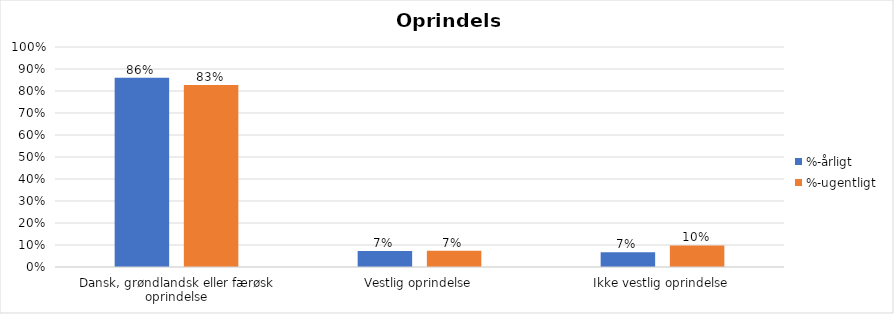
| Category | %-årligt | %-ugentligt |
|---|---|---|
| Dansk, grøndlandsk eller færøsk oprindelse | 0.86 | 0.828 |
| Vestlig oprindelse | 0.073 | 0.074 |
| Ikke vestlig oprindelse | 0.067 | 0.098 |